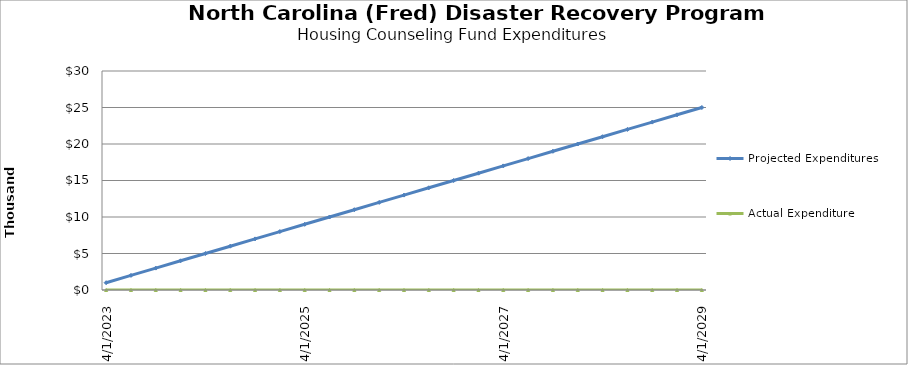
| Category | Projected Expenditures | Actual Expenditure |
|---|---|---|
| 4/1/23 | 1000 | 0 |
| 7/1/23 | 2000 | 0 |
| 10/1/23 | 3000 | 0 |
| 1/1/24 | 4000 | 0 |
| 4/1/24 | 5000 | 0 |
| 7/1/24 | 6000 | 0 |
| 10/1/24 | 7000 | 0 |
| 1/1/25 | 8000 | 0 |
| 4/1/25 | 9000 | 0 |
| 7/1/25 | 10000 | 0 |
| 10/1/25 | 11000 | 0 |
| 1/1/26 | 12000 | 0 |
| 4/1/26 | 13000 | 0 |
| 7/1/26 | 14000 | 0 |
| 10/1/26 | 15000 | 0 |
| 1/1/27 | 16000 | 0 |
| 4/1/27 | 17000 | 0 |
| 7/1/27 | 18000 | 0 |
| 10/1/27 | 19000 | 0 |
| 1/1/28 | 20000 | 0 |
| 4/1/28 | 21000 | 0 |
| 7/1/28 | 22000 | 0 |
| 10/1/28 | 23000 | 0 |
| 1/1/29 | 24000 | 0 |
| 4/1/29 | 25000 | 0 |